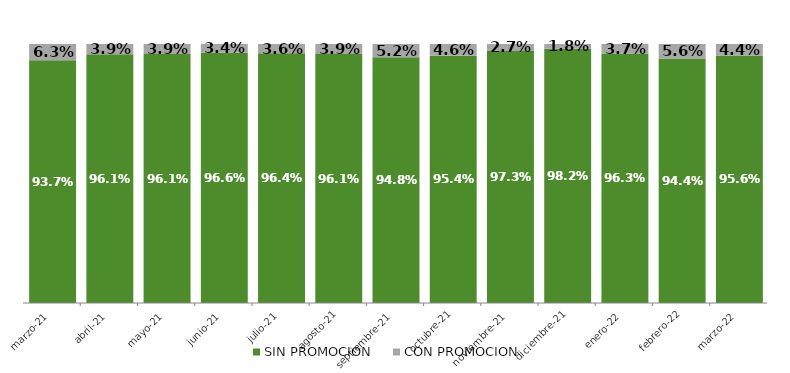
| Category | SIN PROMOCION   | CON PROMOCION   |
|---|---|---|
| 2021-03-01 | 0.937 | 0.063 |
| 2021-04-01 | 0.961 | 0.039 |
| 2021-05-01 | 0.961 | 0.039 |
| 2021-06-01 | 0.966 | 0.034 |
| 2021-07-01 | 0.964 | 0.036 |
| 2021-08-01 | 0.961 | 0.039 |
| 2021-09-01 | 0.948 | 0.052 |
| 2021-10-01 | 0.954 | 0.046 |
| 2021-11-01 | 0.973 | 0.027 |
| 2021-12-01 | 0.982 | 0.018 |
| 2022-01-01 | 0.963 | 0.037 |
| 2022-02-01 | 0.944 | 0.056 |
| 2022-03-01 | 0.956 | 0.044 |